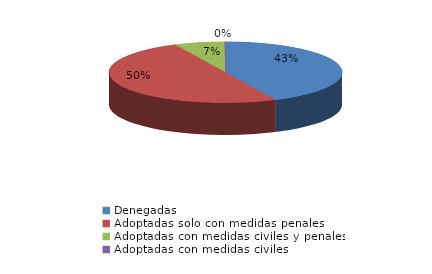
| Category | Series 0 |
|---|---|
| Denegadas | 281 |
| Adoptadas solo con medidas penales | 327 |
| Adoptadas con medidas civiles y penales | 45 |
| Adoptadas con medidas civiles | 1 |